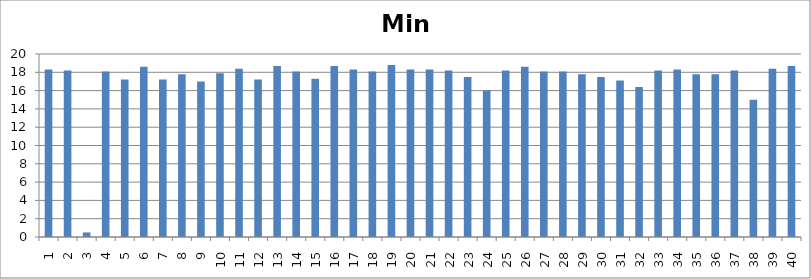
| Category | Min |
|---|---|
| 1.0 | 18.3 |
| 2.0 | 18.2 |
| 3.0 | 0.5 |
| 4.0 | 18.1 |
| 5.0 | 17.2 |
| 6.0 | 18.6 |
| 7.0 | 17.2 |
| 8.0 | 17.8 |
| 9.0 | 17 |
| 10.0 | 17.9 |
| 11.0 | 18.4 |
| 12.0 | 17.2 |
| 13.0 | 18.7 |
| 14.0 | 18.1 |
| 15.0 | 17.3 |
| 16.0 | 18.7 |
| 17.0 | 18.3 |
| 18.0 | 18.1 |
| 19.0 | 18.8 |
| 20.0 | 18.3 |
| 21.0 | 18.3 |
| 22.0 | 18.2 |
| 23.0 | 17.5 |
| 24.0 | 16 |
| 25.0 | 18.2 |
| 26.0 | 18.6 |
| 27.0 | 18.1 |
| 28.0 | 18.1 |
| 29.0 | 17.8 |
| 30.0 | 17.5 |
| 31.0 | 17.1 |
| 32.0 | 16.4 |
| 33.0 | 18.2 |
| 34.0 | 18.3 |
| 35.0 | 17.8 |
| 36.0 | 17.8 |
| 37.0 | 18.2 |
| 38.0 | 15 |
| 39.0 | 18.4 |
| 40.0 | 18.7 |